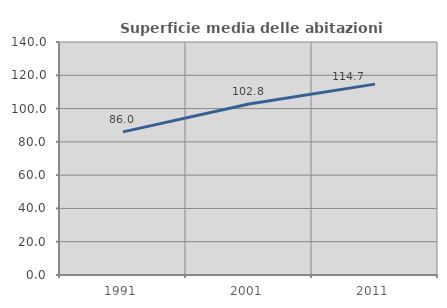
| Category | Superficie media delle abitazioni occupate |
|---|---|
| 1991.0 | 86.014 |
| 2001.0 | 102.756 |
| 2011.0 | 114.686 |